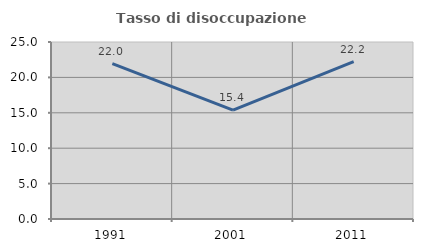
| Category | Tasso di disoccupazione giovanile  |
|---|---|
| 1991.0 | 21.951 |
| 2001.0 | 15.385 |
| 2011.0 | 22.222 |